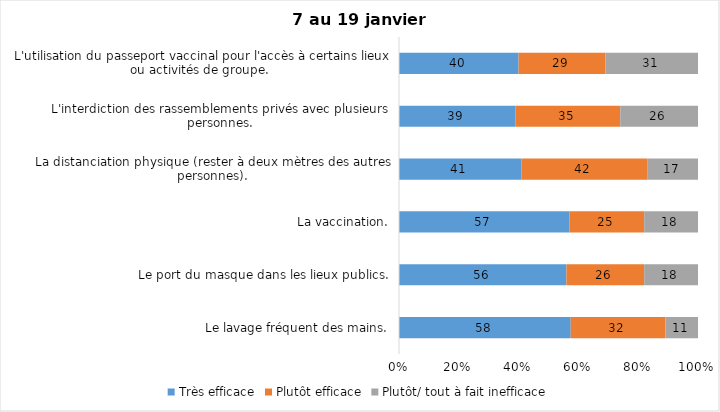
| Category | Très efficace | Plutôt efficace | Plutôt/ tout à fait inefficace |
|---|---|---|---|
| Le lavage fréquent des mains. | 58 | 32 | 11 |
| Le port du masque dans les lieux publics. | 56 | 26 | 18 |
| La vaccination. | 57 | 25 | 18 |
| La distanciation physique (rester à deux mètres des autres personnes). | 41 | 42 | 17 |
| L'interdiction des rassemblements privés avec plusieurs personnes. | 39 | 35 | 26 |
| L'utilisation du passeport vaccinal pour l'accès à certains lieux ou activités de groupe.  | 40 | 29 | 31 |